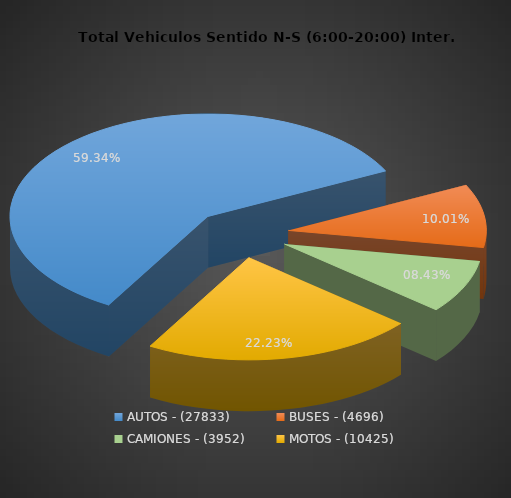
| Category | PORCENTAJE |
|---|---|
| AUTOS - (27833) | 59.338 |
| BUSES - (4696) | 10.012 |
| CAMIONES - (3952) | 8.425 |
| MOTOS - (10425) | 22.225 |